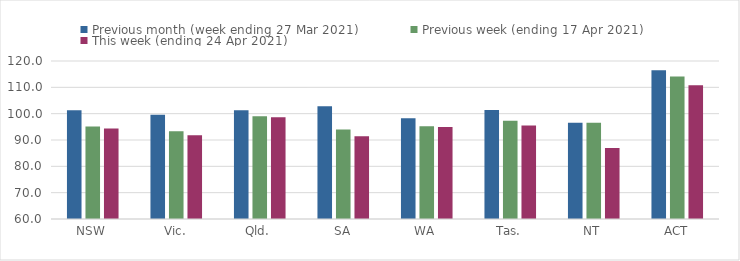
| Category | Previous month (week ending 27 Mar 2021) | Previous week (ending 17 Apr 2021) | This week (ending 24 Apr 2021) |
|---|---|---|---|
| NSW | 101.34 | 95.09 | 94.41 |
| Vic. | 99.62 | 93.32 | 91.76 |
| Qld. | 101.26 | 99.06 | 98.64 |
| SA | 102.77 | 93.95 | 91.41 |
| WA | 98.26 | 95.21 | 94.92 |
| Tas. | 101.4 | 97.32 | 95.55 |
| NT | 96.59 | 96.59 | 86.95 |
| ACT | 116.47 | 114.12 | 110.8 |